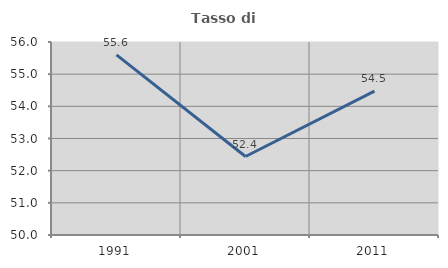
| Category | Tasso di occupazione   |
|---|---|
| 1991.0 | 55.601 |
| 2001.0 | 52.44 |
| 2011.0 | 54.472 |